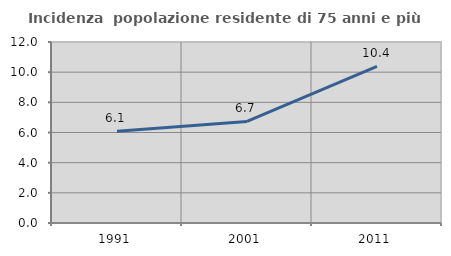
| Category | Incidenza  popolazione residente di 75 anni e più |
|---|---|
| 1991.0 | 6.075 |
| 2001.0 | 6.733 |
| 2011.0 | 10.384 |